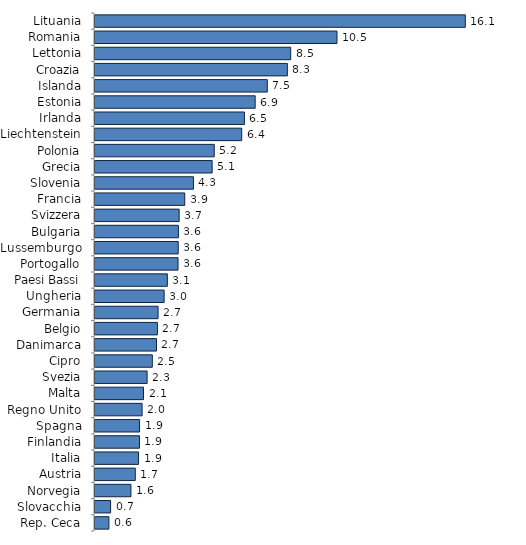
| Category | nationals |
|---|---|
| Lituania | 16.062 |
| Romania | 10.496 |
| Lettonia | 8.488 |
| Croazia | 8.344 |
| Islanda | 7.474 |
| Estonia | 6.947 |
| Irlanda | 6.481 |
| Liechtenstein | 6.363 |
| Polonia | 5.172 |
| Grecia | 5.081 |
| Slovenia | 4.27 |
| Francia | 3.892 |
| Svizzera | 3.65 |
| Bulgaria | 3.619 |
| Lussemburgo | 3.61 |
| Portogallo | 3.602 |
| Paesi Bassi | 3.139 |
| Ungheria | 2.998 |
| Germania | 2.736 |
| Belgio | 2.708 |
| Danimarca | 2.666 |
| Cipro | 2.486 |
| Svezia | 2.26 |
| Malta | 2.104 |
| Regno Unito | 2.043 |
| Spagna | 1.932 |
| Finlandia | 1.929 |
| Italia | 1.889 |
| Austria | 1.748 |
| Norvegia | 1.558 |
| Slovacchia | 0.677 |
| Rep. Ceca | 0.603 |